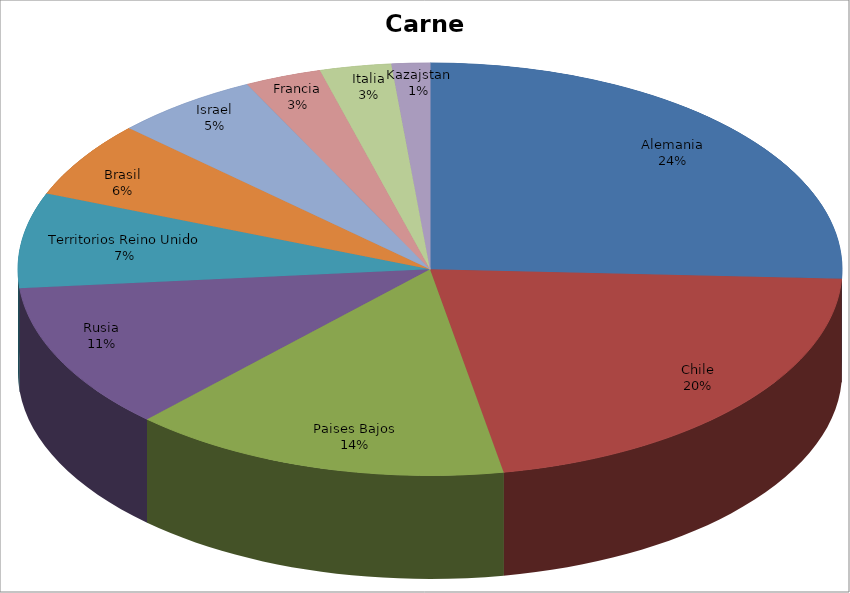
| Category | Series 0 | Series 1 |
|---|---|---|
| Alemania | 26.589 | 0.238 |
| Chile | 22.104 | 0.198 |
| Paises Bajos | 15.396 | 0.138 |
| Rusia | 11.86 | 0.106 |
| Territorios Reino Unido | 7.695 | 0.069 |
| Brasil | 6.194 | 0.056 |
| Israel | 5.9 | 0.053 |
| Francia | 3.108 | 0.028 |
| Italia | 2.898 | 0.026 |
| Kazajstan | 1.548 | 0.014 |